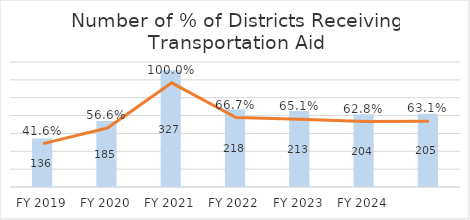
| Category | Number of Districts Receiving Aid |
|---|---|
| FY 2019 | 136 |
| FY 2020 | 185 |
| FY 2021 | 327 |
| FY 2022 | 218 |
| FY 2023 | 213 |
| FY 2024 | 204 |